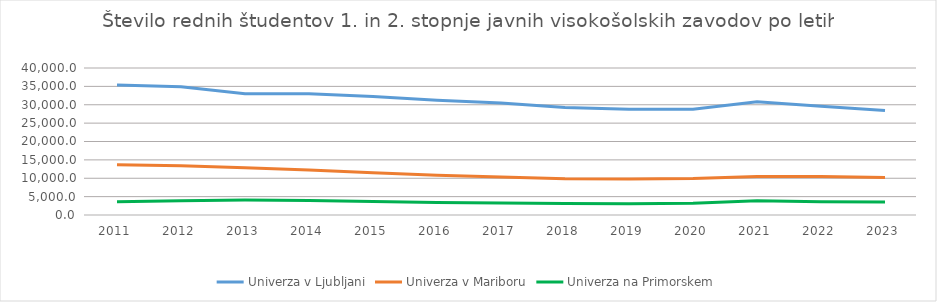
| Category | Univerza v Ljubljani | Univerza v Mariboru | Univerza na Primorskem |
|---|---|---|---|
| 2011.0 | 35395 | 13676 | 3609 |
| 2012.0 | 34887.5 | 13373.5 | 3900 |
| 2013.0 | 32990 | 12841.5 | 4088 |
| 2014.0 | 33010.5 | 12256 | 3912 |
| 2015.0 | 32255.5 | 11470.5 | 3658 |
| 2016.0 | 31232.5 | 10823.5 | 3410 |
| 2017.0 | 30500 | 10358 | 3283 |
| 2018.0 | 29261 | 9879 | 3149 |
| 2019.0 | 28794 | 9787 | 3080 |
| 2020.0 | 28809 | 9929 | 3213 |
| 2021.0 | 30833 | 10469 | 3890 |
| 2022.0 | 29565 | 10497 | 3573 |
| 2023.0 | 28468 | 10202 | 3515 |